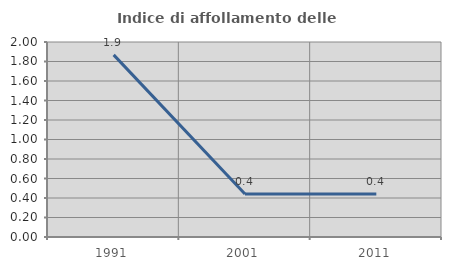
| Category | Indice di affollamento delle abitazioni  |
|---|---|
| 1991.0 | 1.868 |
| 2001.0 | 0.441 |
| 2011.0 | 0.44 |